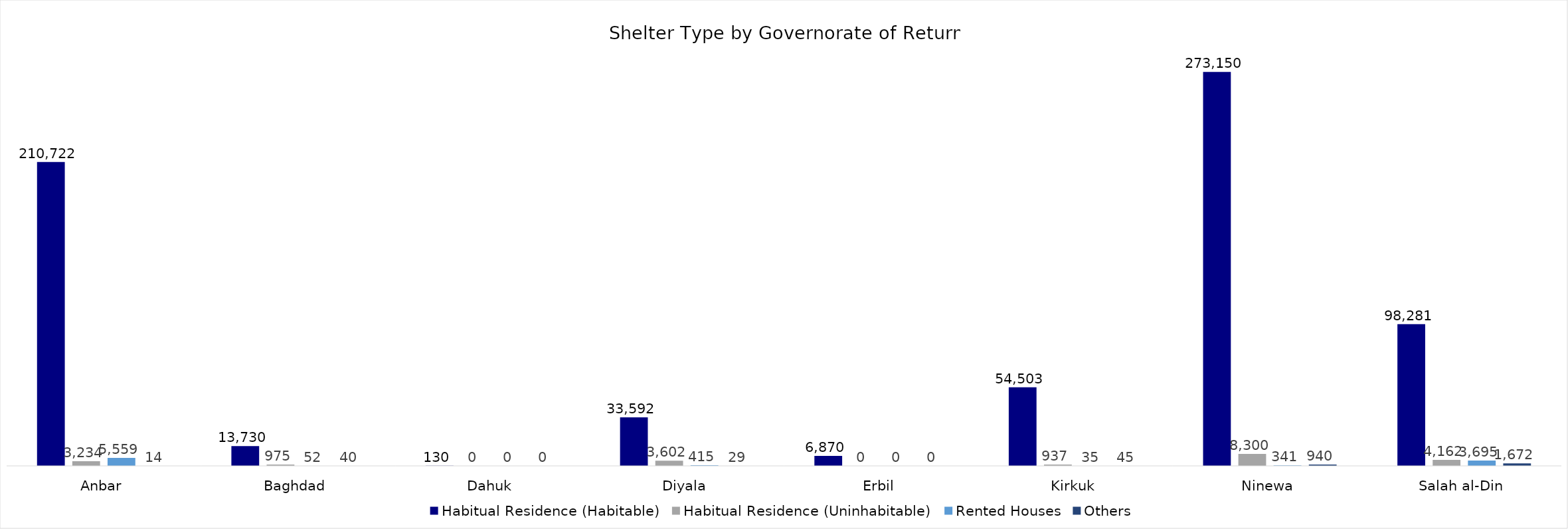
| Category | Habitual Residence (Habitable) | Habitual Residence (Uninhabitable) | Rented Houses | Others |
|---|---|---|---|---|
| Anbar | 210722 | 3234 | 5559 | 14 |
| Baghdad | 13730 | 975 | 52 | 40 |
| Dahuk | 130 | 0 | 0 | 0 |
| Diyala | 33592 | 3602 | 415 | 29 |
| Erbil | 6870 | 0 | 0 | 0 |
| Kirkuk | 54503 | 937 | 35 | 45 |
| Ninewa | 273150 | 8300 | 341 | 940 |
| Salah al-Din | 98281 | 4162 | 3695 | 1672 |